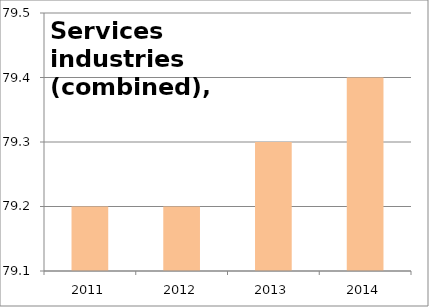
| Category | G-Q: Total services  |
|---|---|
| 2011.0 | 79.2 |
| 2012.0 | 79.2 |
| 2013.0 | 79.3 |
| 2014.0 | 79.4 |